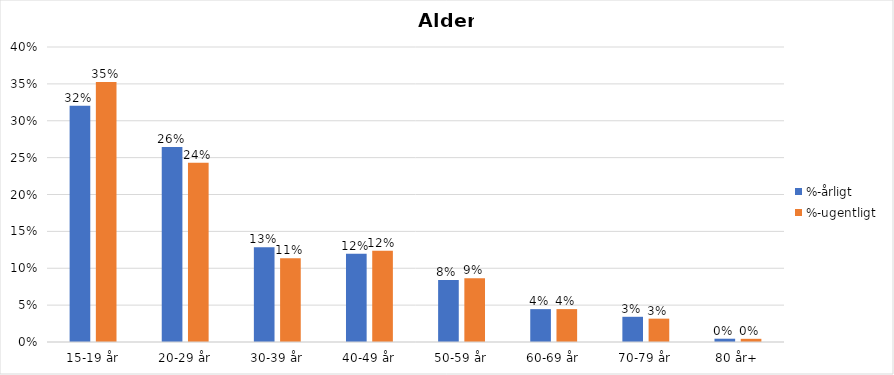
| Category | %-årligt | %-ugentligt |
|---|---|---|
| 15-19 år | 0.32 | 0.353 |
| 20-29 år | 0.264 | 0.243 |
| 30-39 år | 0.129 | 0.114 |
| 40-49 år | 0.12 | 0.124 |
| 50-59 år | 0.084 | 0.086 |
| 60-69 år | 0.045 | 0.045 |
| 70-79 år | 0.034 | 0.032 |
| 80 år+ | 0.004 | 0.004 |